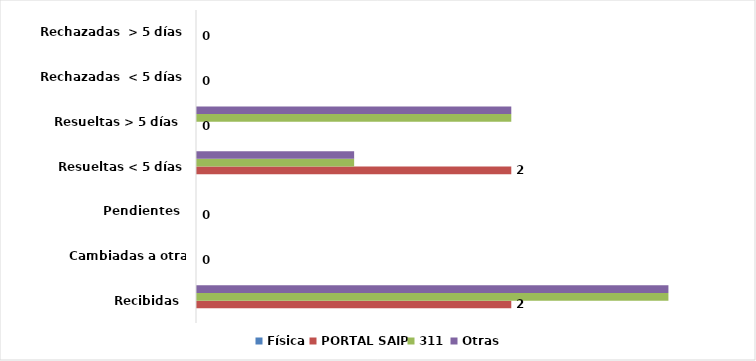
| Category | Física | PORTAL SAIP | 311 | Otras |
|---|---|---|---|---|
| Recibidas  | 0 | 2 | 3 | 3 |
| Cambiadas a otra institución | 0 | 0 | 0 | 0 |
| Pendientes  | 0 | 0 | 0 | 0 |
| Resueltas < 5 días | 0 | 2 | 1 | 1 |
| Resueltas > 5 días  | 0 | 0 | 2 | 2 |
| Rechazadas  < 5 días | 0 | 0 | 0 | 0 |
| Rechazadas  > 5 días | 0 | 0 | 0 | 0 |